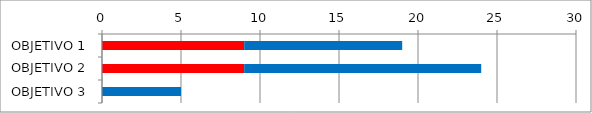
| Category | Series 2 | Series 5 |
|---|---|---|
| OBJETIVO 1 | 9 | 10 |
| OBJETIVO 2 | 9 | 15 |
| OBJETIVO 3 | 0 | 5 |